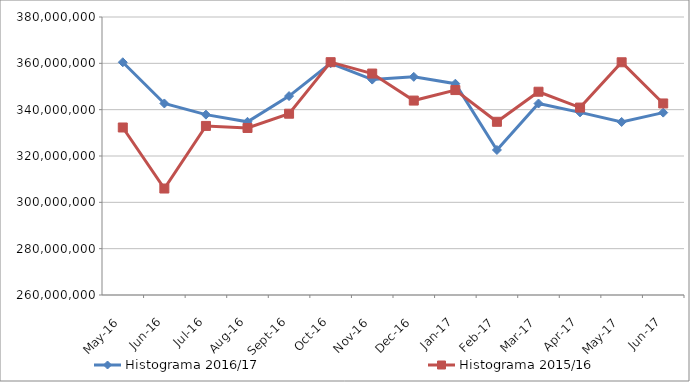
| Category | Histograma 2016/17 | Histograma 2015/16 |
|---|---|---|
| 2016-05-01 | 360454738.432 | 332305747.474 |
| 2016-06-01 | 342679386.953 | 305958509.914 |
| 2016-07-01 | 337848025.526 | 332980062.156 |
| 2016-08-01 | 334758138.096 | 332106326.64 |
| 2016-09-01 | 345866794.51 | 338255482.1 |
| 2016-10-01 | 360033687.212 | 360500345.282 |
| 2016-11-01 | 352981693.316 | 355586985.022 |
| 2016-12-01 | 354172060.622 | 343923409.461 |
| 2017-01-01 | 351208981.531 | 348461686.103 |
| 2017-02-01 | 322599377.36 | 334765861.737 |
| 2017-03-01 | 342660139.838 | 347743462.077 |
| 2017-04-01 | 338822832.91 | 340899487.363 |
| 2017-05-01 | 334694116.703 | 360454738.432 |
| 2017-06-01 | 338725696.483 | 342679386.953 |